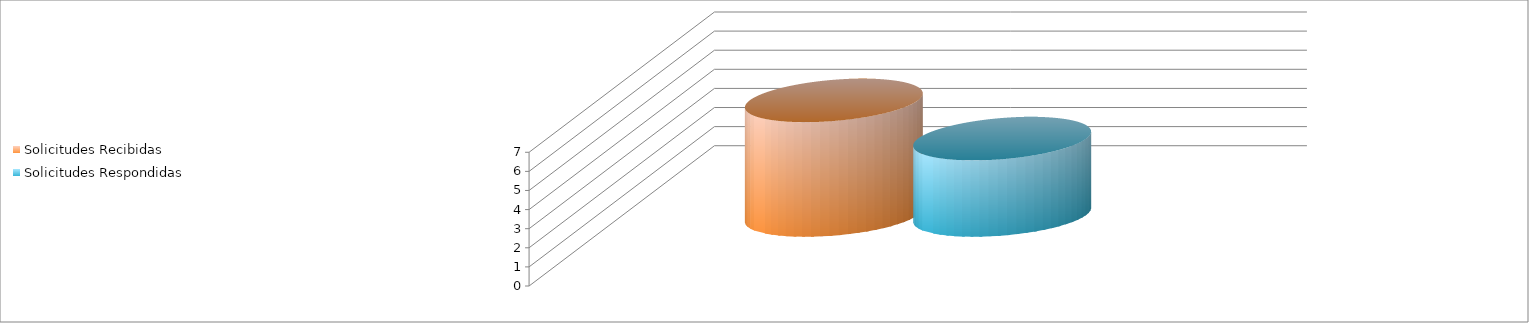
| Category | Solicitudes Recibidas | Solicitudes Respondidas |
|---|---|---|
| - | 6 | 4 |